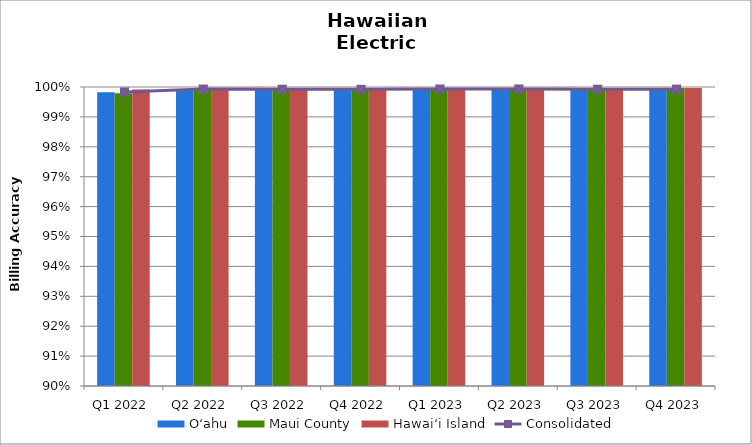
| Category | O‘ahu | Maui County | Hawai‘i Island |
|---|---|---|---|
| Q1 2022 | 0.998 | 0.998 | 0.999 |
| Q2 2022 | 0.999 | 0.999 | 0.999 |
| Q3 2022 | 0.999 | 0.999 | 0.999 |
| Q4 2022 | 0.999 | 0.999 | 0.999 |
| Q1 2023 | 0.999 | 0.999 | 0.999 |
| Q2 2023 | 0.999 | 1 | 1 |
| Q3 2023 | 0.999 | 1 | 1 |
| Q4 2023 | 0.999 | 1 | 1 |